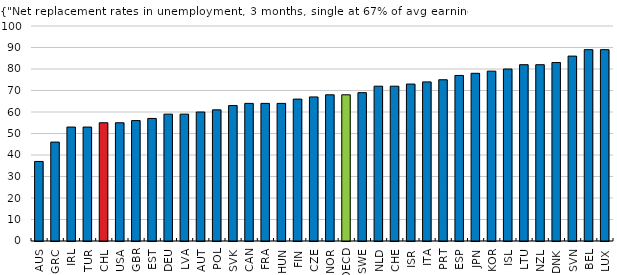
| Category | 2020 or latest |
|---|---|
| AUS | 37 |
| GRC | 46 |
| IRL | 53 |
| TUR | 53 |
| CHL | 55 |
| USA | 55 |
| GBR | 56 |
| EST | 57 |
| DEU | 59 |
| LVA | 59 |
| AUT | 60 |
| POL | 61 |
| SVK | 63 |
| CAN | 64 |
| FRA | 64 |
| HUN | 64 |
| FIN | 66 |
| CZE | 67 |
| NOR | 68 |
| OECD | 68 |
| SWE | 69 |
| NLD | 72 |
| CHE | 72 |
| ISR | 73 |
| ITA | 74 |
| PRT | 75 |
| ESP | 77 |
| JPN | 78 |
| KOR | 79 |
| ISL | 80 |
| LTU | 82 |
| NZL | 82 |
| DNK | 83 |
| SVN | 86 |
| BEL | 89 |
| LUX | 89 |